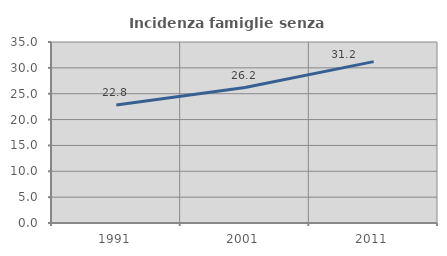
| Category | Incidenza famiglie senza nuclei |
|---|---|
| 1991.0 | 22.815 |
| 2001.0 | 26.197 |
| 2011.0 | 31.203 |